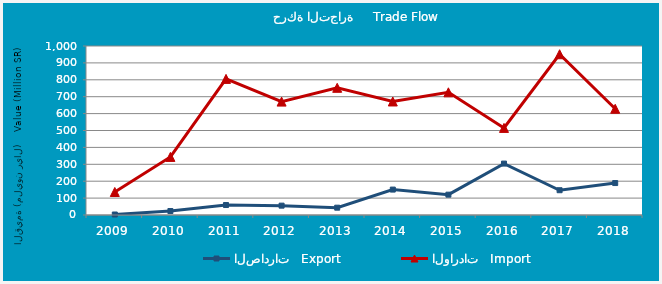
| Category | الصادرات   Export | الواردات   Import |
|---|---|---|
| 2009.0 | 2944742 | 136096274 |
| 2010.0 | 23437622 | 343705040 |
| 2011.0 | 59070447 | 805451322 |
| 2012.0 | 55319773 | 671022594 |
| 2013.0 | 43289248 | 752591409 |
| 2014.0 | 150379687 | 671759083 |
| 2015.0 | 120358327 | 725905673 |
| 2016.0 | 304259679 | 515387948 |
| 2017.0 | 146554074 | 951209444 |
| 2018.0 | 189031378 | 628544598 |